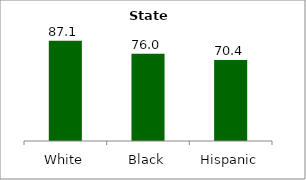
| Category | Series 0 |
|---|---|
| White | 87.088 |
| Black | 75.954 |
| Hispanic | 70.41 |